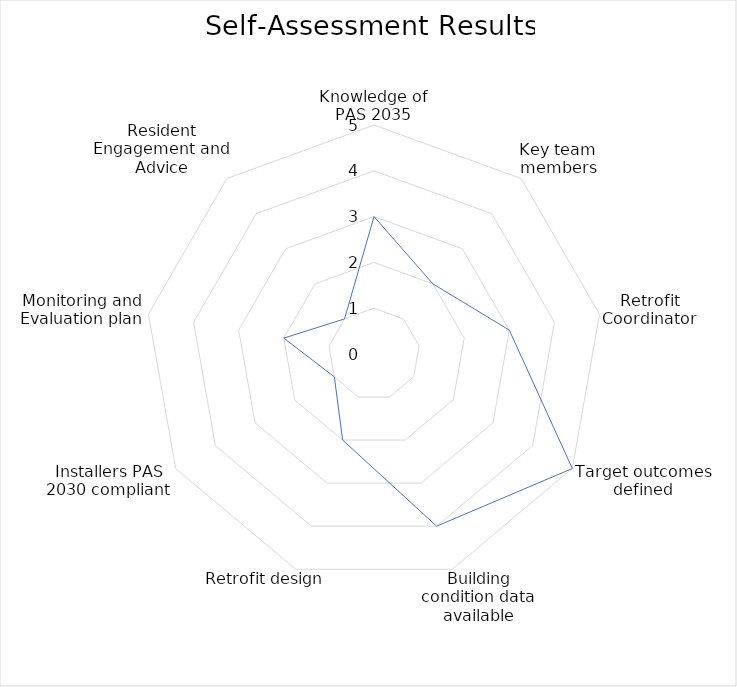
| Category | Series 0 |
|---|---|
| Knowledge of PAS 2035 | 3 |
| Key team members | 2 |
| Retrofit Coordinator | 3 |
| Target outcomes defined | 5 |
| Building condition data available | 4 |
| Retrofit design | 2 |
| Installers PAS 2030 compliant | 1 |
| Monitoring and Evaluation plan | 2 |
| Resident Engagement and Advice | 1 |